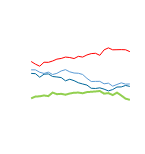
| Category | East | North | South | West |
|---|---|---|---|---|
| 0 | 5348 | 2945 | 6490 | 5688 |
| 1 | 5320 | 3121 | 6236 | 5687 |
| 2 | 4976 | 3144 | 6039 | 5456 |
| 3 | 5270 | 3227 | 6420 | 5340 |
| 4 | 5297 | 3161 | 6410 | 5469 |
| 5 | 5047 | 3502 | 6538 | 5238 |
| 6 | 5003 | 3347 | 6718 | 5351 |
| 7 | 4947 | 3382 | 6784 | 5581 |
| 8 | 4633 | 3298 | 6917 | 5706 |
| 9 | 4784 | 3411 | 6872 | 5497 |
| 10 | 4648 | 3491 | 6773 | 5383 |
| 11 | 4447 | 3501 | 6986 | 5360 |
| 12 | 4329 | 3437 | 6916 | 5243 |
| 13 | 4222 | 3550 | 7120 | 4870 |
| 14 | 3916 | 3578 | 7248 | 4569 |
| 15 | 3896 | 3611 | 7279 | 4579 |
| 16 | 3958 | 3653 | 7085 | 4582 |
| 17 | 3830 | 3399 | 7611 | 4345 |
| 18 | 3664 | 3451 | 7799 | 4407 |
| 19 | 3793 | 3262 | 7614 | 4118 |
| 20 | 4035 | 3496 | 7624 | 4281 |
| 21 | 4046 | 3222 | 7633 | 4438 |
| 22 | 4187 | 2917 | 7619 | 4314 |
| 23 | 4096 | 2805 | 7437 | 4331 |